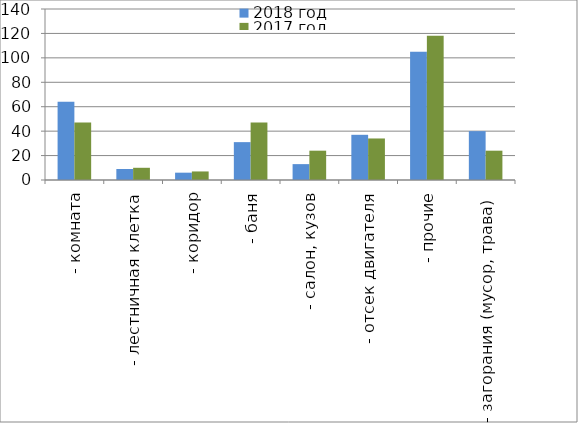
| Category | 2018 год | 2017 год |
|---|---|---|
|  - комната | 64 | 47 |
|  - лестничная клетка | 9 | 10 |
|  - коридор | 6 | 7 |
|  - баня | 31 | 47 |
|  - салон, кузов | 13 | 24 |
|  - отсек двигателя | 37 | 34 |
| - прочие | 105 | 118 |
| - загорания (мусор, трава)  | 40 | 24 |